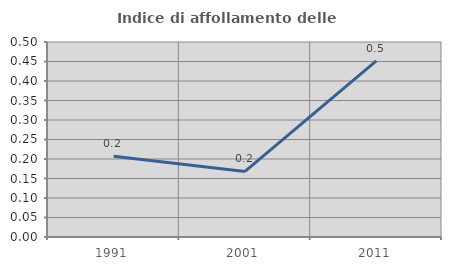
| Category | Indice di affollamento delle abitazioni  |
|---|---|
| 1991.0 | 0.207 |
| 2001.0 | 0.168 |
| 2011.0 | 0.452 |